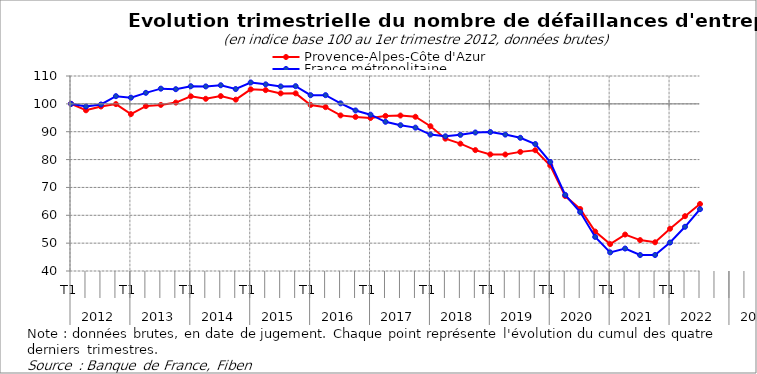
| Category | Provence-Alpes-Côte d'Azur | France métropolitaine |
|---|---|---|
| 0 | 100 | 100 |
| 1 | 97.69 | 99.041 |
| 2 | 99.06 | 99.774 |
| 3 | 99.92 | 102.757 |
| 4 | 96.32 | 102.22 |
| 5 | 99.188 | 103.956 |
| 6 | 99.618 | 105.458 |
| 7 | 100.462 | 105.267 |
| 8 | 102.708 | 106.331 |
| 9 | 101.816 | 106.259 |
| 10 | 102.788 | 106.681 |
| 11 | 101.513 | 105.327 |
| 12 | 105.209 | 107.678 |
| 13 | 104.939 | 106.999 |
| 14 | 103.76 | 106.248 |
| 15 | 103.776 | 106.352 |
| 16 | 99.602 | 103.114 |
| 17 | 98.821 | 103.119 |
| 18 | 95.858 | 100.177 |
| 19 | 95.316 | 97.632 |
| 20 | 94.934 | 96.115 |
| 21 | 95.667 | 93.566 |
| 22 | 95.81 | 92.336 |
| 23 | 95.364 | 91.464 |
| 24 | 91.971 | 88.976 |
| 25 | 87.51 | 88.344 |
| 26 | 85.71 | 88.874 |
| 27 | 83.4 | 89.72 |
| 28 | 81.854 | 89.885 |
| 29 | 81.823 | 88.974 |
| 30 | 82.762 | 87.815 |
| 31 | 83.352 | 85.567 |
| 32 | 77.872 | 79.116 |
| 33 | 66.911 | 67.329 |
| 34 | 62.259 | 61.156 |
| 35 | 54.166 | 52.238 |
| 36 | 49.657 | 46.687 |
| 37 | 53.083 | 48.062 |
| 38 | 51.091 | 45.733 |
| 39 | 50.311 | 45.743 |
| 40 | 55.17 | 50.209 |
| 41 | 59.678 | 55.874 |
| 42 | 64.043 | 62.193 |